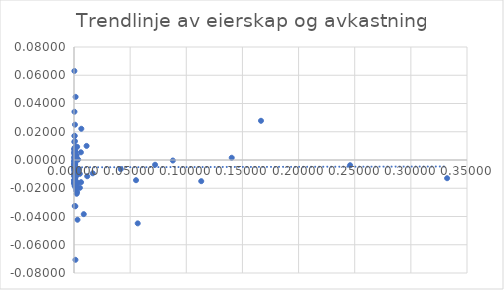
| Category | Series 0 |
|---|---|
| 0.00023115298681709233 | -0.001 |
| 0.0012 | -0.033 |
| 0.0008 | 0.004 |
| 0.00021945210655072655 | 0.002 |
| 0.0015813784762450012 | 0.004 |
| 0.0 | -0.016 |
| 0.005172048625014135 | -0.01 |
| 0.0008861980235444139 | -0.005 |
| 0.1665303857666496 | 0.028 |
| 0.0004 | 0.009 |
| 0.0013 | -0.071 |
| 0.0010223319461726752 | -0.011 |
| 0.0008191903449479407 | 0.013 |
| 0.00013728016980114066 | -0.01 |
| 0.0112 | 0.01 |
| 0.00020851698518656965 | -0.011 |
| 0.0018278201209073978 | -0.009 |
| 0.0006695918020169416 | -0.006 |
| 0.33227900073781924 | -0.013 |
| 0.0001265607998158437 | -0.015 |
| 0.0005 | -0.001 |
| 0.0006018495806229883 | -0.006 |
| 0.0018794269012865049 | -0.011 |
| 0.011774773002243258 | -0.011 |
| 0.00628696670859278 | -0.016 |
| 0.0001980452650267387 | -0.01 |
| 0.0007799970978285392 | 0 |
| 0.00016414944962567013 | -0.003 |
| 0.0021391691434422756 | -0.017 |
| 0.0011680213442347104 | -0.013 |
| 0.0004842428578682265 | 0.017 |
| 0.0011154443757192289 | -0.014 |
| 0.002806774055238904 | 0.009 |
| 0.0031 | -0.042 |
| 0.0016 | 0.009 |
| 0.0007 | -0.007 |
| 0.0037123537913334543 | 0 |
| 0.0006672693960784447 | -0.014 |
| 0.0007149598565675485 | -0.014 |
| 0.14047338571960066 | 0.002 |
| 0.0087 | -0.038 |
| 0.07220604932238771 | -0.003 |
| 0.24588935695115402 | -0.004 |
| 0.003467043595915613 | -0.016 |
| 0.0018903057531208395 | -0.022 |
| 0.0035785120476896914 | -0.009 |
| 0.000699357659883844 | -0.004 |
| 0.0061503534018977875 | 0.005 |
| 0.005258083669203507 | -0.02 |
| 0.0014317608837763843 | -0.02 |
| 0.0006774924185142361 | 0.007 |
| 0.00410818701756315 | -0.007 |
| 0.0024 | -0.024 |
| 0.0002595313500263658 | -0.011 |
| 0.0002150097562035386 | -0.002 |
| 0.00012615069855855925 | -0.005 |
| 0.0018477978961699518 | -0.01 |
| 0.0013458433491862706 | 0.003 |
| 0.00046785156207055235 | -0.006 |
| 0.0005476785940811693 | 0.001 |
| 0.0013356570894122175 | 0.006 |
| 0.00042150122363745525 | 0.004 |
| 0.00025064852215895194 | 0.013 |
| 0.0022303495682828777 | -0.008 |
| 0.0009988300305536235 | -0.007 |
| 0.00165893698442908 | -0.018 |
| 0.0005247466455924037 | -0.006 |
| 0.00040691446519699115 | 0.008 |
| 0.0003990322715591934 | -0.016 |
| 0.0004880685234893642 | -0.008 |
| 0.00015238989812994718 | 0.008 |
| 0.00041008365977458837 | -0.007 |
| 0.0027 | -0.023 |
| 0.055245692699294024 | -0.014 |
| 0.0011458478338760992 | -0.008 |
| 0.0010843163189620288 | 0.001 |
| 0.0001523884416425563 | -0.005 |
| 0.0002259066787112356 | -0.014 |
| 0.0004942704226655578 | 0.002 |
| 0.0006428551134384107 | -0.033 |
| 0.0009999908251586977 | -0.003 |
| 0.016696945936160466 | -0.009 |
| 0.0005084635570901136 | -0.018 |
| 0.00072015186675707 | -0.007 |
| 0.08801167522340708 | 0 |
| 0.00027844682435660583 | -0.006 |
| 0.00025298676391990115 | -0.01 |
| 0.000840726804417122 | 0.004 |
| 0.0011553190869533444 | 0.006 |
| 0.0022431693858321992 | 0.003 |
| 0.0008390870070072087 | -0.018 |
| 0.0004443807727332833 | -0.014 |
| 0.0009427044041259418 | -0.013 |
| 0.0010006183918867902 | -0.003 |
| 0.0003374569664220461 | 0.006 |
| 0.00016642098091662047 | -0.003 |
| 0.11331668565997388 | -0.015 |
| 0.00020837098023288898 | -0.014 |
| 0.00034641073943863295 | -0.008 |
| 0.00011097748891312593 | -0.016 |
| 0.0002243079874956221 | -0.003 |
| 0.006512622934518222 | 0.022 |
| 0.001186020139019977 | -0.002 |
| 0.0005152007740349949 | 0.017 |
| 0.00016696260084055116 | -0.001 |
| 3.027877476889338e-05 | 0.005 |
| 0.05675197311235473 | -0.045 |
| 0.00041008365977458837 | 0.034 |
| 0.001434 | 0.045 |
| 0.0003609831443199048 | 0.001 |
| 0.0003489786288085406 | 0.063 |
| 0.041641115984213266 | -0.006 |
| 0.0008499078682596311 | 0.025 |